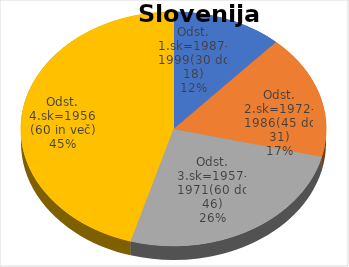
| Category | Slovenija skupaj |
|---|---|
| Odst. 1.sk=1987-1999(30 do 18) | 2.53 |
| Odst. 2.sk=1972-1986(45 do 31) | 3.71 |
| Odst. 3.sk=1957-1971(60 do 46) | 5.56 |
| Odst. 4.sk=1956 (60 in več) | 9.84 |